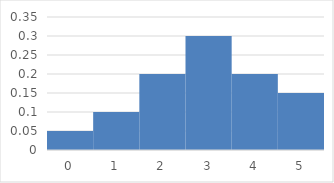
| Category | nr of packs sold / week |
|---|---|
| 0.0 | 0.05 |
| 1.0 | 0.1 |
| 2.0 | 0.2 |
| 3.0 | 0.3 |
| 4.0 | 0.2 |
| 5.0 | 0.15 |